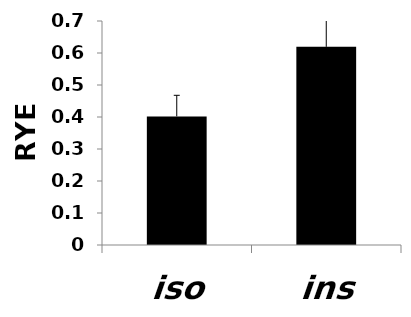
| Category | Series 0 |
|---|---|
| iso | 0.402 |
| ins | 0.619 |